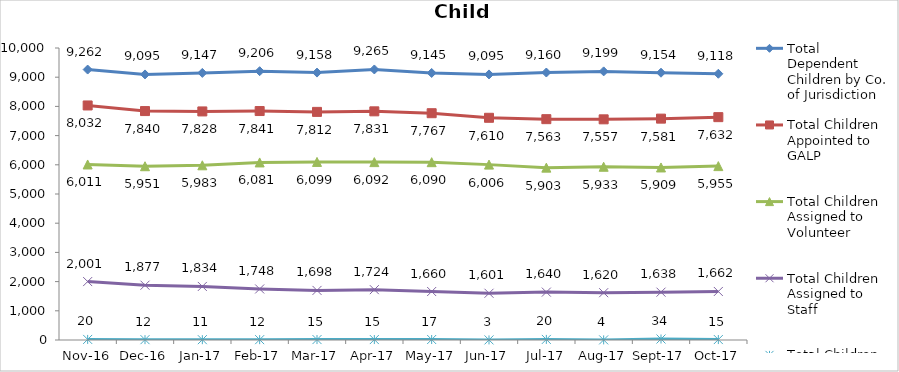
| Category | Total Dependent Children by Co. of Jurisdiction | Total Children Appointed to GALP | Total Children Assigned to Volunteer | Total Children Assigned to Staff | Total Children Unassigned |
|---|---|---|---|---|---|
| 2016-11-01 | 9262 | 8032 | 6011 | 2001 | 20 |
| 2016-12-01 | 9095 | 7840 | 5951 | 1877 | 12 |
| 2017-01-01 | 9147 | 7828 | 5983 | 1834 | 11 |
| 2017-02-01 | 9206 | 7841 | 6081 | 1748 | 12 |
| 2017-03-01 | 9158 | 7812 | 6099 | 1698 | 15 |
| 2017-04-01 | 9265 | 7831 | 6092 | 1724 | 15 |
| 2017-05-01 | 9145 | 7767 | 6090 | 1660 | 17 |
| 2017-06-01 | 9095 | 7610 | 6006 | 1601 | 3 |
| 2017-07-01 | 9160 | 7563 | 5903 | 1640 | 20 |
| 2017-08-01 | 9199 | 7557 | 5933 | 1620 | 4 |
| 2017-09-01 | 9154 | 7581 | 5909 | 1638 | 34 |
| 2017-10-01 | 9118 | 7632 | 5955 | 1662 | 15 |